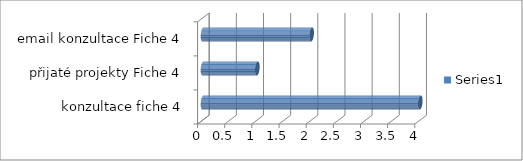
| Category | Series 0 |
|---|---|
| konzultace fiche 4 | 4 |
| přijaté projekty Fiche 4 | 1 |
| email konzultace Fiche 4 | 2 |